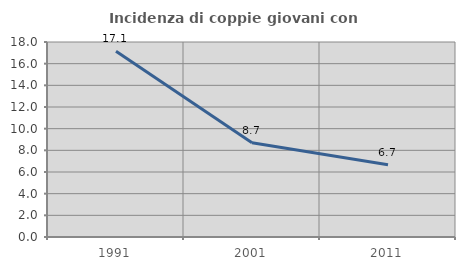
| Category | Incidenza di coppie giovani con figli |
|---|---|
| 1991.0 | 17.143 |
| 2001.0 | 8.696 |
| 2011.0 | 6.667 |